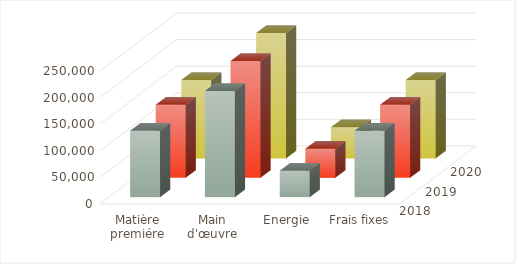
| Category | 2018 | 2019 | 2020 |
|---|---|---|---|
| Matière premiére | 125000 | 137500 | 147500 |
| Main d'œuvre | 200000 | 220000 | 236000 |
| Energie | 50000 | 55000 | 59000 |
| Frais fixes | 125000 | 137500 | 147500 |